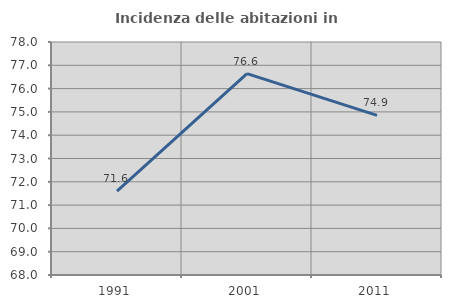
| Category | Incidenza delle abitazioni in proprietà  |
|---|---|
| 1991.0 | 71.597 |
| 2001.0 | 76.643 |
| 2011.0 | 74.85 |